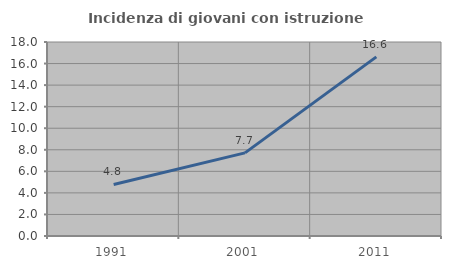
| Category | Incidenza di giovani con istruzione universitaria |
|---|---|
| 1991.0 | 4.786 |
| 2001.0 | 7.711 |
| 2011.0 | 16.616 |